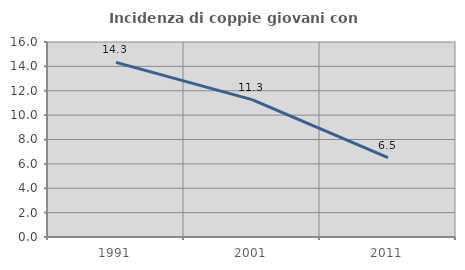
| Category | Incidenza di coppie giovani con figli |
|---|---|
| 1991.0 | 14.324 |
| 2001.0 | 11.276 |
| 2011.0 | 6.522 |